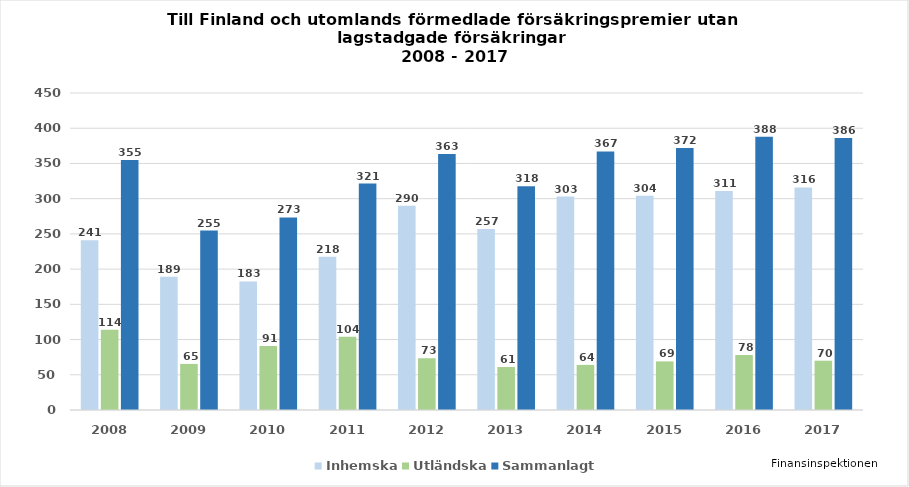
| Category | Inhemska | Utländska | Sammanlagt |
|---|---|---|---|
| 2008.0 | 241 | 114 | 355 |
| 2009.0 | 189.249 | 65.417 | 254.666 |
| 2010.0 | 182.562 | 90.729 | 273.291 |
| 2011.0 | 217.55 | 103.894 | 321.444 |
| 2012.0 | 289.922 | 73.321 | 363.243 |
| 2013.0 | 257 | 61 | 317.523 |
| 2014.0 | 303 | 64 | 367 |
| 2015.0 | 304 | 69 | 372 |
| 2016.0 | 311 | 78 | 388 |
| 2017.0 | 316 | 70 | 386 |